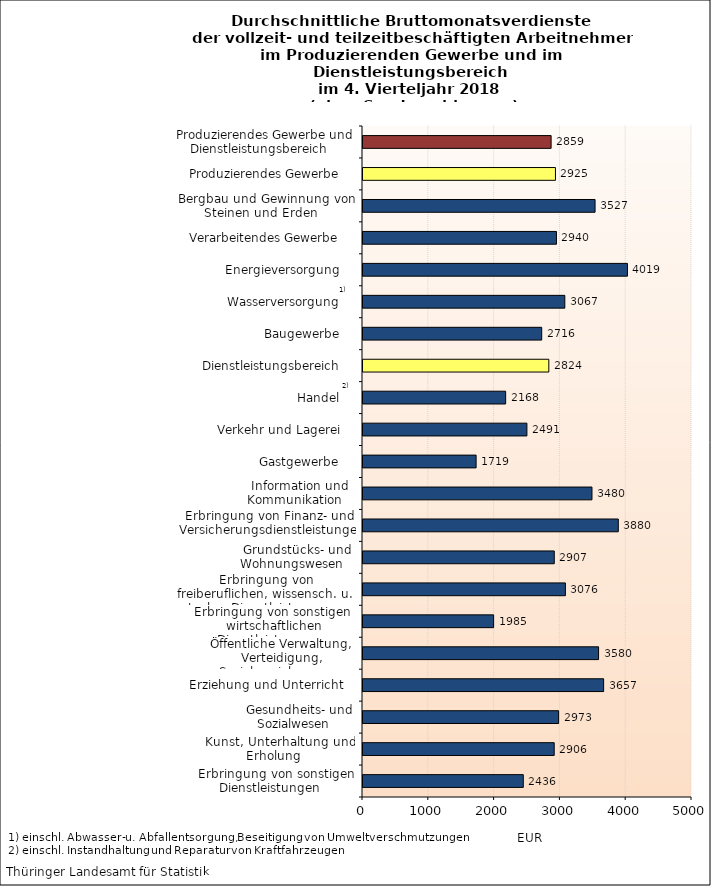
| Category | Series 0 |
|---|---|
| Erbringung von sonstigen Dienstleistungen    | 2436 |
| Kunst, Unterhaltung und Erholung    | 2906 |
| Gesundheits- und Sozialwesen    | 2973 |
| Erziehung und Unterricht    | 3657 |
| Öffentliche Verwaltung, Verteidigung, Sozialversicherung    | 3580 |
| Erbringung von sonstigen  wirtschaftlichen Dienstleistungen    | 1985 |
| Erbringung von freiberuflichen, wissensch. u. techn. Dienstleistungen    | 3076 |
| Grundstücks- und Wohnungswesen    | 2907 |
| Erbringung von Finanz- und Versicherungsdienstleistungen    | 3880 |
| Information und Kommunikation    | 3480 |
| Gastgewerbe    | 1719 |
| Verkehr und Lagerei    | 2491 |
| Handel    | 2168 |
| Dienstleistungsbereich    | 2824 |
| Baugewerbe    | 2716 |
| Wasserversorgung    | 3067 |
| Energieversorgung    | 4019 |
| Verarbeitendes Gewerbe    | 2940 |
| Bergbau und Gewinnung von Steinen und Erden    | 3527 |
| Produzierendes Gewerbe    | 2925 |
| Produzierendes Gewerbe und Dienstleistungsbereich    | 2859 |